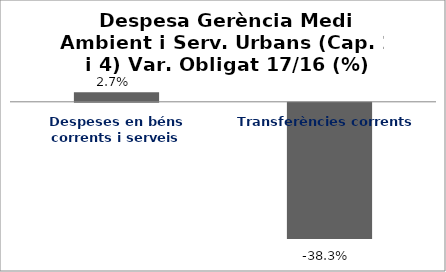
| Category | Series 0 |
|---|---|
| Despeses en béns corrents i serveis | 0.027 |
| Transferències corrents | -0.383 |